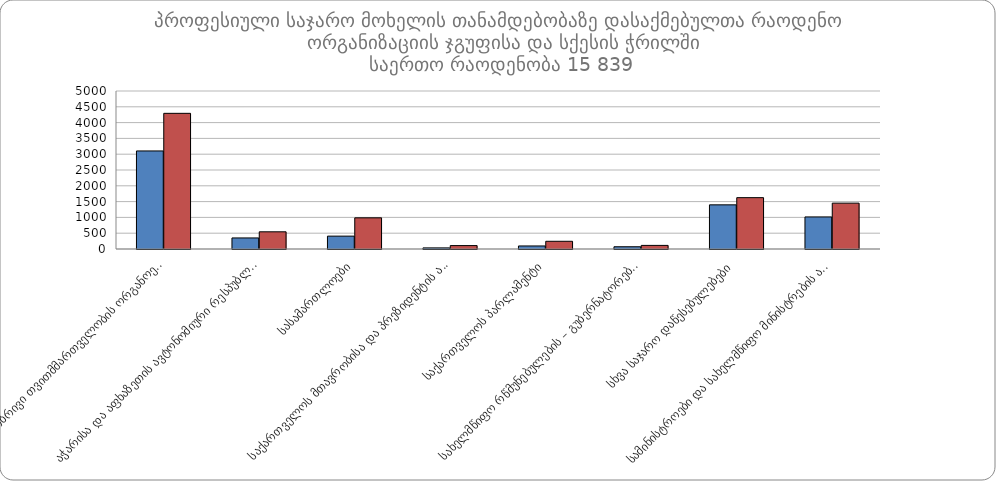
| Category |  მამრობითი |  მდედრობითი |
|---|---|---|
|  ადგილობრივი თვითმმართველობის ორგანოები | 3103 | 4293 |
|  აჭარისა და აფხაზეთის ავტონომიური რესპუბლიკები | 350 | 544 |
|  სასამართლოები | 407 | 986 |
|  საქართველოს მთავრობისა და პრეზიდენტის ადმინისტრაციები | 35 | 108 |
|  საქართველოს პარლამენტი | 96 | 244 |
|  სახელმწიფო რწმუნებულების – გუბერნატორების ადმინისტრაციები | 71 | 114 |
|  სხვა საჯარო დაწესებულებები | 1397 | 1625 |
|  სამინისტროები და სახელმწიფო მინისტრების აპარატი | 1015 | 1451 |